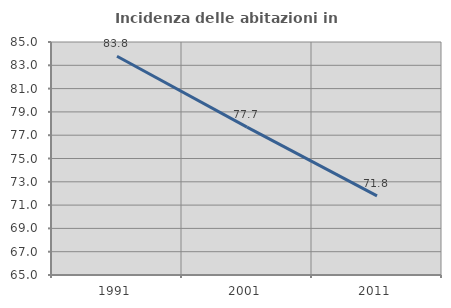
| Category | Incidenza delle abitazioni in proprietà  |
|---|---|
| 1991.0 | 83.773 |
| 2001.0 | 77.697 |
| 2011.0 | 71.795 |